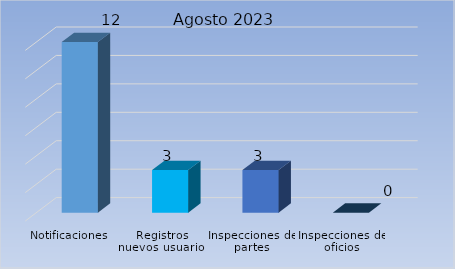
| Category | Cantidad |
|---|---|
| Notificaciones | 12 |
| Registros nuevos usuarios | 3 |
| Inspecciones de partes | 3 |
| Inspecciones de oficios | 0 |